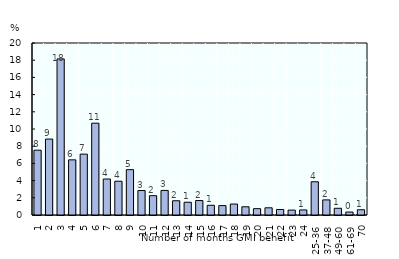
| Category | Series 0 |
|---|---|
| 1 | 7.538 |
| 2 | 8.83 |
| 3 | 18.149 |
| 4 | 6.413 |
| 5 | 7.077 |
| 6 | 10.675 |
| 7 | 4.185 |
| 8 | 3.927 |
| 9 | 5.271 |
| 10 | 2.847 |
| 11 | 2.244 |
| 12 | 2.858 |
| 13 | 1.656 |
| 14 | 1.481 |
| 15 | 1.681 |
| 16 | 1.128 |
| 17 | 1.09 |
| 18 | 1.273 |
| 19 | 0.954 |
| 20 | 0.736 |
| 21 | 0.837 |
| 22 | 0.639 |
| 23 | 0.568 |
| 24 | 0.59 |
| 25-36 | 3.866 |
| 37-48 | 1.756 |
| 49-60 | 0.781 |
| 61-69 | 0.342 |
| 70 | 0.609 |